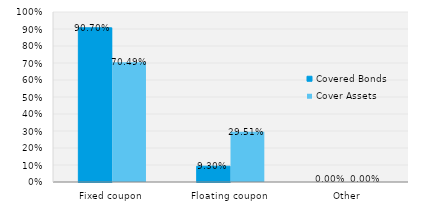
| Category | Covered Bonds | Cover Assets |
|---|---|---|
| Fixed coupon | 0.907 | 0.705 |
| Floating coupon | 0.093 | 0.295 |
| Other | 0 | 0 |